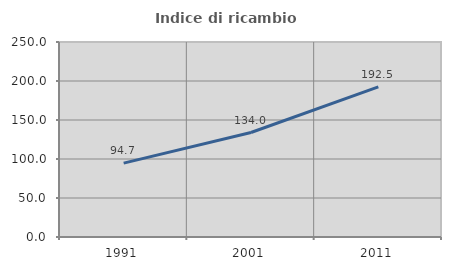
| Category | Indice di ricambio occupazionale  |
|---|---|
| 1991.0 | 94.719 |
| 2001.0 | 133.968 |
| 2011.0 | 192.523 |